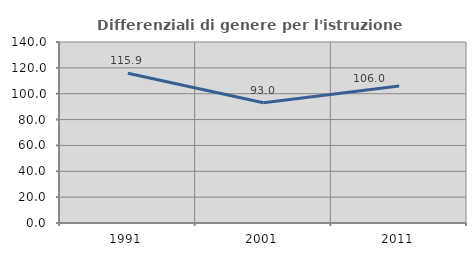
| Category | Differenziali di genere per l'istruzione superiore |
|---|---|
| 1991.0 | 115.896 |
| 2001.0 | 92.954 |
| 2011.0 | 106.015 |